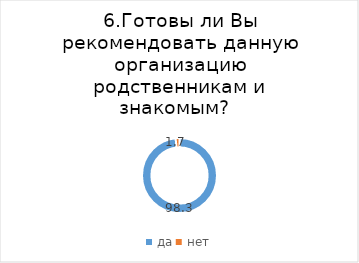
| Category | Series 0 |
|---|---|
| да | 98.347 |
| нет | 1.653 |